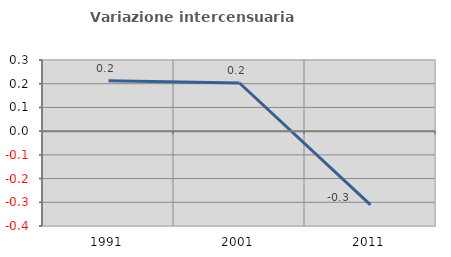
| Category | Variazione intercensuaria annua |
|---|---|
| 1991.0 | 0.213 |
| 2001.0 | 0.203 |
| 2011.0 | -0.311 |